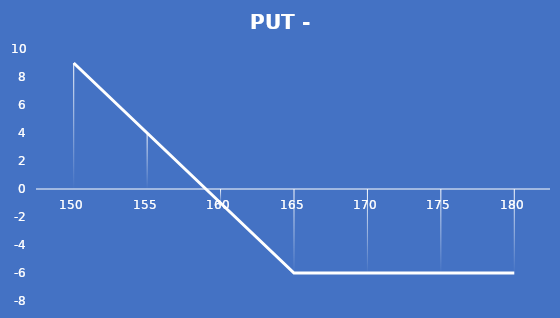
| Category | PUT - Profit |
|---|---|
| 150.0 | 9 |
| 155.0 | 4 |
| 160.0 | -1 |
| 165.0 | -6 |
| 170.0 | -6 |
| 175.0 | -6 |
| 180.0 | -6 |